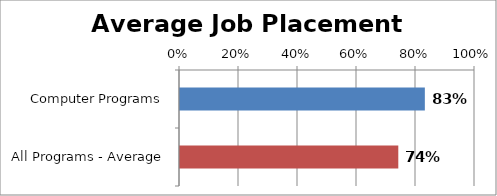
| Category | Series 0 |
|---|---|
| Computer Programs | 0.83 |
| All Programs - Average | 0.74 |